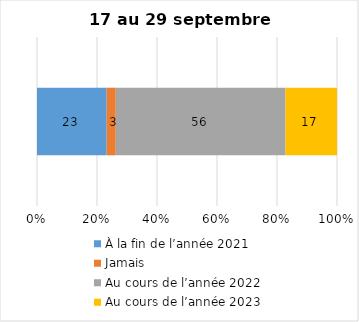
| Category | À la fin de l’année 2021 | Jamais | Au cours de l’année 2022 | Au cours de l’année 2023 |
|---|---|---|---|---|
| 0 | 23 | 3 | 56 | 17 |